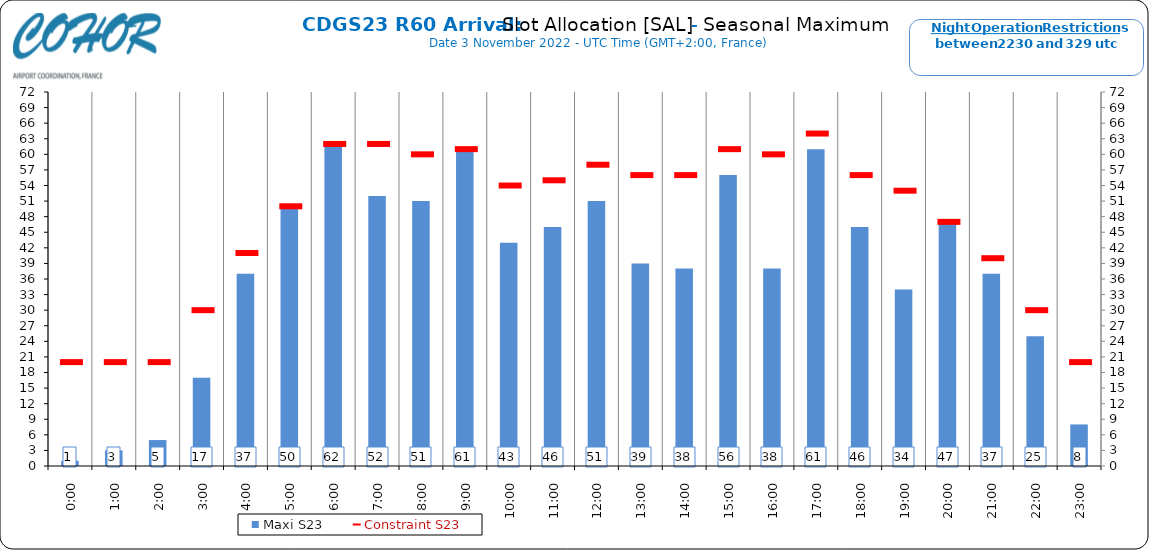
| Category | Maxi S23 |
|---|---|
| 0:00 | 1 |
| 1:00 | 3 |
| 2:00 | 5 |
| 3:00 | 17 |
| 4:00 | 37 |
| 5:00 | 50 |
| 6:00 | 62 |
| 7:00 | 52 |
| 8:00 | 51 |
| 9:00 | 61 |
| 10:00 | 43 |
| 11:00 | 46 |
| 12:00 | 51 |
| 13:00 | 39 |
| 14:00 | 38 |
| 15:00 | 56 |
| 16:00 | 38 |
| 17:00 | 61 |
| 18:00 | 46 |
| 19:00 | 34 |
| 20:00 | 47 |
| 21:00 | 37 |
| 22:00 | 25 |
| 23:00 | 8 |